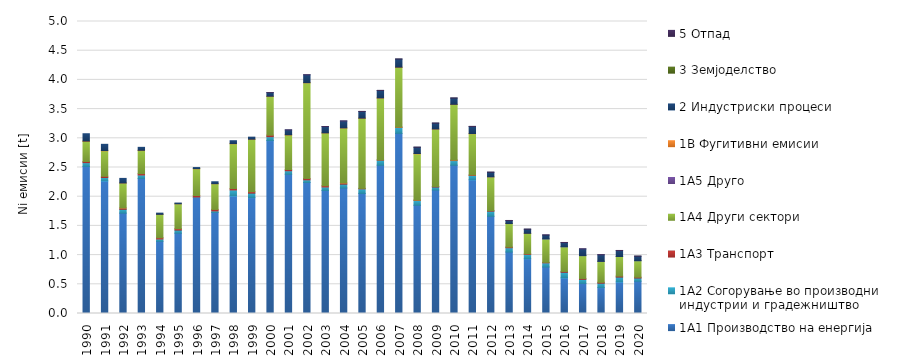
| Category | 1A1 | 1A2 | 1A3 | 1A4 | 1A5 | 1B | 2 | 3 | 5 |
|---|---|---|---|---|---|---|---|---|---|
| 1990.0 | 2.519 | 0.064 | 0.021 | 0.344 | 0 | 0.006 | 0.125 | 0 | 0 |
| 1991.0 | 2.27 | 0.059 | 0.021 | 0.435 | 0 | 0.005 | 0.106 | 0 | 0 |
| 1992.0 | 1.718 | 0.065 | 0.024 | 0.425 | 0 | 0.003 | 0.078 | 0 | 0 |
| 1993.0 | 2.312 | 0.059 | 0.024 | 0.394 | 0 | 0.005 | 0.05 | 0 | 0 |
| 1994.0 | 1.236 | 0.04 | 0.022 | 0.399 | 0 | 0.001 | 0.02 | 0 | 0 |
| 1995.0 | 1.375 | 0.053 | 0.025 | 0.425 | 0 | 0.001 | 0.012 | 0 | 0 |
| 1996.0 | 1.991 | 0.005 | 0.025 | 0.457 | 0 | 0.004 | 0.019 | 0 | 0 |
| 1997.0 | 1.73 | 0.027 | 0.025 | 0.439 | 0 | 0.002 | 0.033 | 0 | 0 |
| 1998.0 | 2.012 | 0.103 | 0.025 | 0.765 | 0 | 0.004 | 0.049 | 0 | 0 |
| 1999.0 | 1.984 | 0.077 | 0.025 | 0.895 | 0 | 0.004 | 0.034 | 0 | 0 |
| 2000.0 | 2.961 | 0.067 | 0.026 | 0.661 | 0 | 0.005 | 0.062 | 0 | 0 |
| 2001.0 | 2.384 | 0.06 | 0.022 | 0.59 | 0 | 0.005 | 0.082 | 0 | 0 |
| 2002.0 | 2.244 | 0.045 | 0.024 | 1.637 | 0 | 0.003 | 0.135 | 0 | 0 |
| 2003.0 | 2.106 | 0.061 | 0.022 | 0.901 | 0 | 0.004 | 0.107 | 0 | 0.001 |
| 2004.0 | 2.148 | 0.066 | 0.021 | 0.939 | 0 | 0.005 | 0.117 | 0 | 0.001 |
| 2005.0 | 2.056 | 0.079 | 0.008 | 1.199 | 0 | 0.005 | 0.113 | 0 | 0.001 |
| 2006.0 | 2.538 | 0.087 | 0.008 | 1.055 | 0 | 0.005 | 0.127 | 0 | 0.001 |
| 2007.0 | 3.084 | 0.101 | 0.009 | 1.02 | 0 | 0.005 | 0.138 | 0 | 0.001 |
| 2008.0 | 1.853 | 0.081 | 0.009 | 0.79 | 0 | 0.005 | 0.108 | 0 | 0.001 |
| 2009.0 | 2.113 | 0.053 | 0.01 | 0.98 | 0 | 0.005 | 0.099 | 0 | 0.001 |
| 2010.0 | 2.538 | 0.08 | 0.01 | 0.949 | 0 | 0.004 | 0.107 | 0 | 0.001 |
| 2011.0 | 2.289 | 0.074 | 0.011 | 0.704 | 0 | 0.004 | 0.121 | 0 | 0.001 |
| 2012.0 | 1.664 | 0.088 | 0.01 | 0.576 | 0 | 0.001 | 0.079 | 0 | 0.001 |
| 2013.0 | 1.052 | 0.074 | 0.012 | 0.402 | 0 | 0 | 0.051 | 0 | 0.001 |
| 2014.0 | 0.937 | 0.074 | 0.012 | 0.349 | 0 | 0 | 0.07 | 0 | 0.001 |
| 2015.0 | 0.796 | 0.071 | 0.009 | 0.402 | 0 | 0 | 0.066 | 0 | 0.002 |
| 2016.0 | 0.609 | 0.096 | 0.015 | 0.423 | 0 | 0 | 0.071 | 0 | 0.002 |
| 2017.0 | 0.515 | 0.069 | 0.016 | 0.391 | 0 | 0 | 0.114 | 0 | 0.002 |
| 2018.0 | 0.443 | 0.076 | 0.016 | 0.36 | 0 | 0 | 0.112 | 0 | 0.002 |
| 2019.0 | 0.54 | 0.084 | 0.017 | 0.336 | 0 | 0 | 0.101 | 0 | 0.002 |
| 2020.0 | 0.552 | 0.055 | 0.014 | 0.283 | 0 | 0 | 0.076 | 0 | 0.002 |